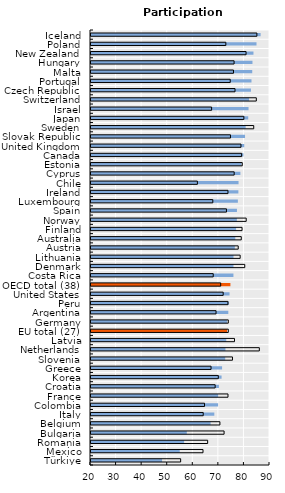
| Category | Foreign-born | Native-born |
|---|---|---|
| Türkiye | 47.786 | 55.058 |
| Mexico | 54.7 | 63.8 |
| Romania | 56.415 | 65.618 |
| Bulgaria | 57.458 | 72.044 |
| Belgium | 66.768 | 70.411 |
| Italy | 68.221 | 63.88 |
| Colombia | 69.7 | 64.4 |
| France | 69.728 | 73.573 |
| Croatia | 70.024 | 68.551 |
| Korea | 71.062 | 69.781 |
| Greece | 71.258 | 66.942 |
| Slovenia | 72.481 | 75.326 |
| Netherlands | 72.574 | 85.828 |
| Latvia | 72.895 | 76.114 |
| EU total (27) | 73.213 | 73.693 |
| Germany | 73.213 | 73.693 |
| Argentina | 73.7 | 68.9 |
| Peru | 73.995 | 73.548 |
| United States | 74.18 | 71.69 |
| OECD total (38) | 74.515 | 70.711 |
| Costa Rica | 75.7 | 67.8 |
| Denmark | 75.717 | 80.126 |
| Lithuania | 75.724 | 78.33 |
| Austria | 76.239 | 77.572 |
| Australia | 76.43 | 78.769 |
| Finland | 76.736 | 79.071 |
| Norway | 77.047 | 80.697 |
| Spain | 77.074 | 72.965 |
| Luxembourg | 77.436 | 67.634 |
| Ireland | 77.635 | 73.558 |
| Chile | 77.7 | 61.6 |
| Cyprus | 78.417 | 75.992 |
| Estonia | 78.803 | 79.148 |
| Canada | 79.611 | 78.915 |
| United Kingdom | 79.931 | 78.652 |
| Slovak Republic | 80.234 | 74.538 |
| Sweden | 80.49 | 83.638 |
| Japan | 81.482 | 79.779 |
| Israel | 81.61 | 67.17 |
| Switzerland | 81.83 | 84.653 |
| Czech Republic | 82.55 | 76.316 |
| Portugal | 82.761 | 74.449 |
| Malta | 83.053 | 75.715 |
| Hungary | 83.142 | 75.957 |
| New Zealand | 83.533 | 80.638 |
| Poland | 84.718 | 72.727 |
| Iceland | 86.326 | 84.871 |